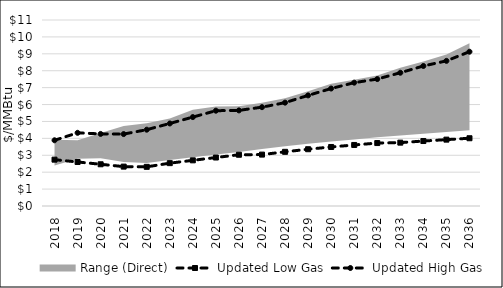
| Category | Updated Low Gas | Updated High Gas |
|---|---|---|
| 2018.0 | 2.742 | 3.886 |
| 2019.0 | 2.603 | 4.328 |
| 2020.0 | 2.468 | 4.263 |
| 2021.0 | 2.329 | 4.254 |
| 2022.0 | 2.316 | 4.513 |
| 2023.0 | 2.534 | 4.881 |
| 2024.0 | 2.701 | 5.258 |
| 2025.0 | 2.867 | 5.636 |
| 2026.0 | 3.031 | 5.654 |
| 2027.0 | 3.04 | 5.846 |
| 2028.0 | 3.204 | 6.112 |
| 2029.0 | 3.357 | 6.541 |
| 2030.0 | 3.491 | 6.947 |
| 2031.0 | 3.609 | 7.294 |
| 2032.0 | 3.723 | 7.507 |
| 2033.0 | 3.747 | 7.881 |
| 2034.0 | 3.842 | 8.28 |
| 2035.0 | 3.925 | 8.584 |
| 2036.0 | 4.007 | 9.124 |